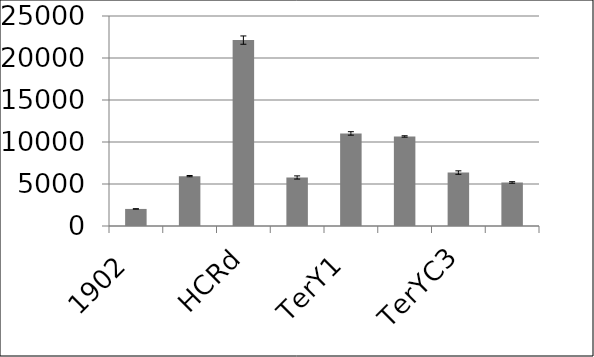
| Category | Series 0 |
|---|---|
| 1902 | 2031.888 |
| HCR | 5937.066 |
| HCRd | 22130.678 |
| HCRc | 5776.769 |
| TerY1 | 11020.121 |
| TerY2 | 10659.805 |
| TerYC3 | 6361.246 |
| TerYC10 | 5183.266 |